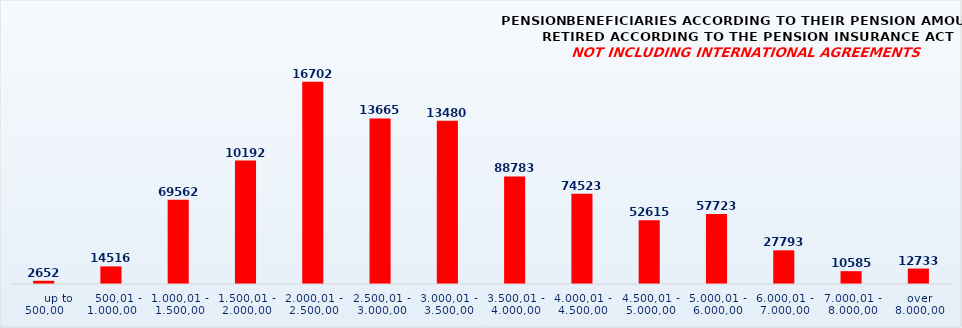
| Category | PENSION BENEFICIARIES ACCORDING TO TYPES AND AMOUNTS OF PENSION, RETIRED ACCORDING TO THE PENSION INSURANCE ACT
NOT INCLUDING INTERNATIONAL AGREEMENTS |
|---|---|
|       up to 500,00 | 2652 |
|    500,01 - 1.000,00 | 14516 |
| 1.000,01 - 1.500,00 | 69562 |
| 1.500,01 - 2.000,00 | 101925 |
| 2.000,01 - 2.500,00 | 167023 |
| 2.500,01 - 3.000,00 | 136653 |
| 3.000,01 - 3.500,00 | 134804 |
| 3.500,01 - 4.000,00 | 88783 |
| 4.000,01 - 4.500,00 | 74523 |
| 4.500,01 - 5.000,00 | 52615 |
| 5.000,01 - 6.000,00 | 57723 |
| 6.000,01 - 7.000,00 | 27793 |
| 7.000,01 - 8.000,00 | 10585 |
|  over  8.000,00 | 12733 |